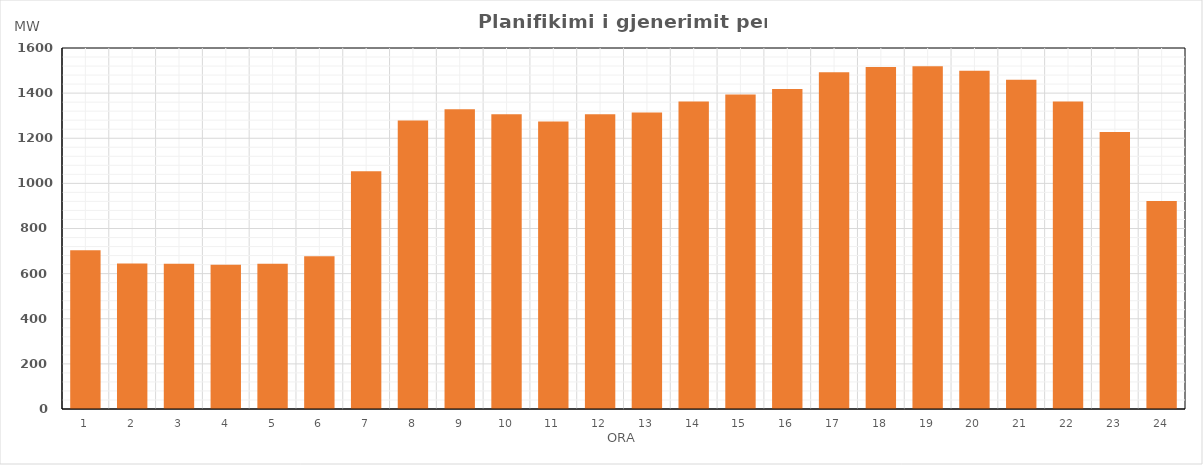
| Category | Max (MW) |
|---|---|
| 0 | 703.73 |
| 1 | 644.53 |
| 2 | 643.73 |
| 3 | 639.58 |
| 4 | 643.89 |
| 5 | 676.72 |
| 6 | 1053.35 |
| 7 | 1278.69 |
| 8 | 1328.83 |
| 9 | 1306.42 |
| 10 | 1274.72 |
| 11 | 1306.3 |
| 12 | 1313.6 |
| 13 | 1362.83 |
| 14 | 1394.29 |
| 15 | 1417.8 |
| 16 | 1492.19 |
| 17 | 1515.28 |
| 18 | 1519.4 |
| 19 | 1498.65 |
| 20 | 1458.94 |
| 21 | 1362.47 |
| 22 | 1227.76 |
| 23 | 922.29 |